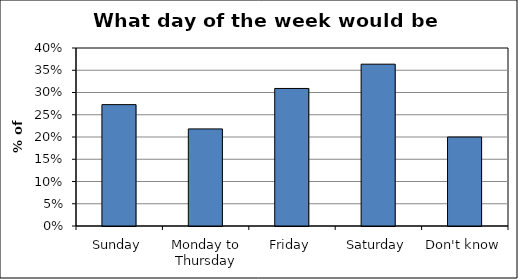
| Category | Series 0 |
|---|---|
| Sunday | 0.273 |
| Monday to Thursday | 0.218 |
| Friday | 0.309 |
| Saturday | 0.364 |
| Don't know | 0.2 |